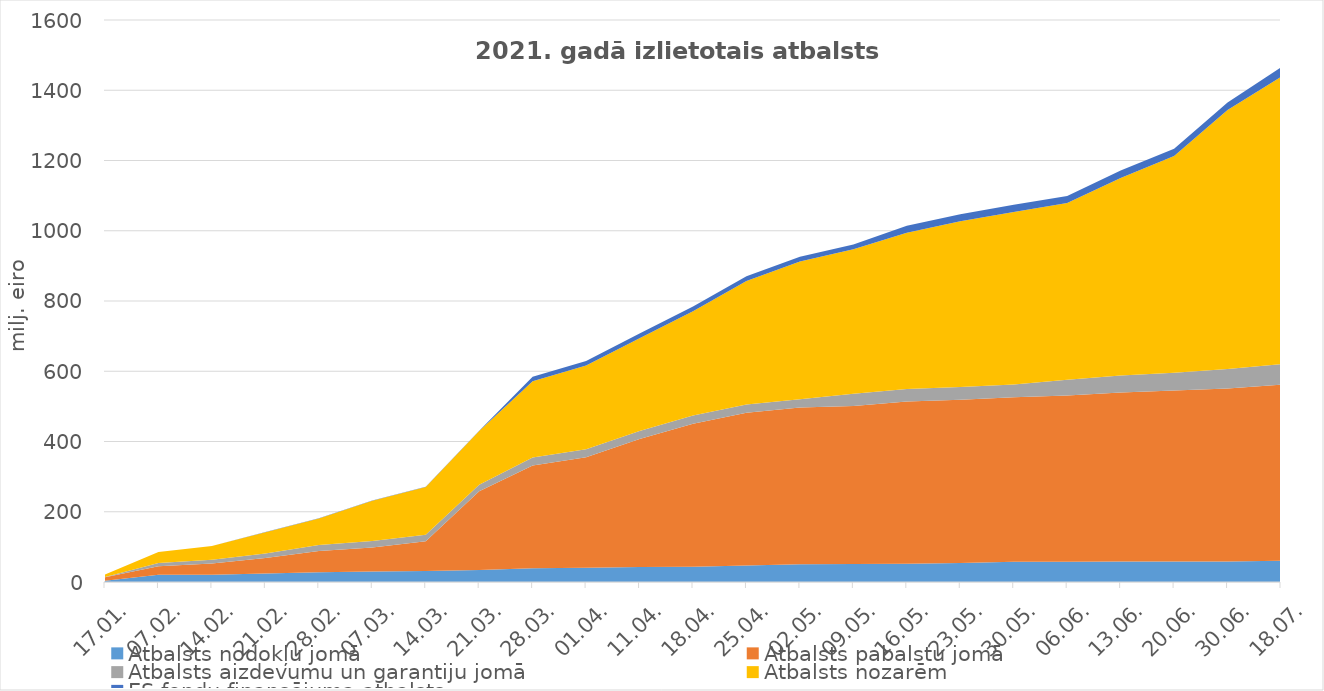
| Category | Atbalsts nodokļu jomā | Atbalsts pabalstu jomā | Atbalsts aizdevumu un garantiju jomā | Atbalsts nozarēm | ES fondu finansējuma atbalsts |
|---|---|---|---|---|---|
| 17.01. | 3.6 | 9.895 | 1 | 6.643 | 0 |
| 07.02. | 20.57 | 24.068 | 9.3 | 31.813 | 0 |
| 14.02. | 20.45 | 32.275 | 10.8 | 39.148 | 0 |
| 21.02. | 24.1 | 44.565 | 12.2 | 61.114 | 0.679 |
| 28.02. | 27.57 | 60.481 | 17.6 | 74.824 | 0.679 |
| 07.03. | 29.78 | 68.502 | 18.1 | 114.636 | 0.679 |
| 14.03. | 31 | 85.042 | 18.2 | 136.395 | 0.679 |
| 21.03. | 34.17 | 224.127 | 18.6 | 153.197 | 0.679 |
| 28.03. | 38.96 | 292.642 | 22.524 | 217.488 | 12.69 |
| 01.04. | 40.7 | 314.459 | 22.724 | 238.269 | 12.69 |
| 11.04. | 42.43 | 364.606 | 23.024 | 263.61 | 13.622 |
| 18.04. | 43.11 | 407.701 | 23.024 | 297.234 | 13.622 |
| 25.04. | 46.81 | 434.906 | 23.324 | 351.962 | 13.622 |
| 02.05. | 50.3 | 446.573 | 23.683 | 392.124 | 13.622 |
| 09.05. | 51 | 449.88 | 34.851 | 411.483 | 13.622 |
| 16.05. | 51.9 | 461.77 | 36.046 | 444.423 | 20.3 |
| 23.05. | 53.87 | 465.321 | 36.246 | 471.262 | 20.3 |
| 30.05. | 57.36 | 468.733 | 36.446 | 491.175 | 20.3 |
| 06.06. | 57.66 | 473.042 | 44.769 | 503.38 | 20.3 |
| 13.06. | 58.25 | 480.982 | 48.461 | 562.799 | 20.95 |
| 20.06. | 58.57 | 486.507 | 50.31 | 617.24 | 20.95 |
| 30.06. | 58.57 | 492 | 56 | 737.399 | 21 |
| 18.07. | 60.5 | 501 | 58.7 | 818.1 | 27 |